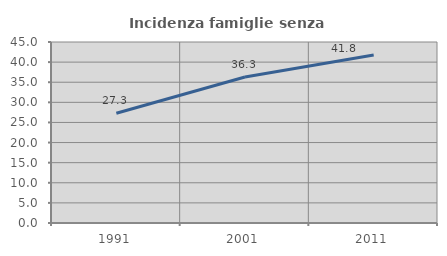
| Category | Incidenza famiglie senza nuclei |
|---|---|
| 1991.0 | 27.273 |
| 2001.0 | 36.284 |
| 2011.0 | 41.761 |